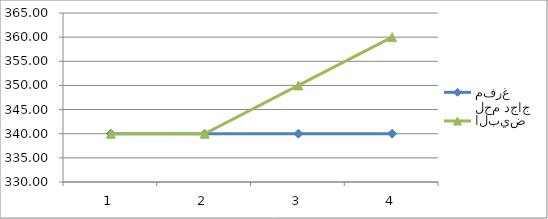
| Category | لحم دجاج مفرغ | البيض |
|---|---|---|
| 0 | 340 | 340 |
| 1 | 340 | 340 |
| 2 | 340 | 350 |
| 3 | 340 | 360 |